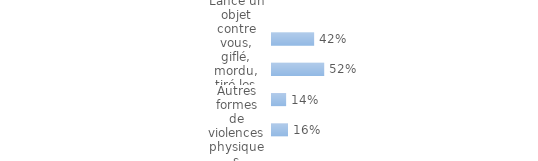
| Category | Series 0 |
|---|---|
| Lancé un objet contre vous, giflé, mordu, tiré les cheveux, bouscoulé brutalement | 0.421 |
| Frappé avec les pieds ou les poings, infligé des brûlures, jeté au sol … | 0.522 |
| Tenté de vous étrangler, de porter atteinte à votre vie ou de vous tuer? | 0.141 |
| Autres formes de violences physiques | 0.16 |